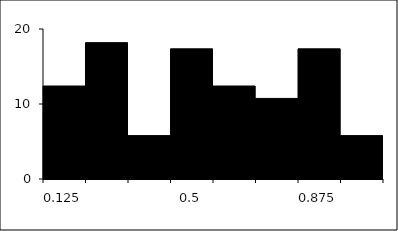
| Category | Series 1 |
|---|---|
| 0.125 | 12.397 |
| 0.25 | 18.182 |
| 0.375 | 5.785 |
| 0.5 | 17.355 |
| 0.625 | 12.397 |
| 0.75 | 10.744 |
| 0.875 | 17.355 |
| 1.0 | 5.785 |